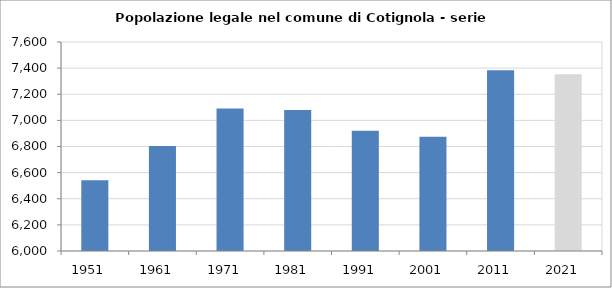
| Category | Popolazione residente |
|---|---|
| 1951   | 6541 |
| 1961   | 6803 |
| 1971   | 7090 |
| 1981   | 7080 |
| 1991   | 6921 |
| 2001   | 6875 |
| 2011   | 7384 |
| 2021   | 7353 |